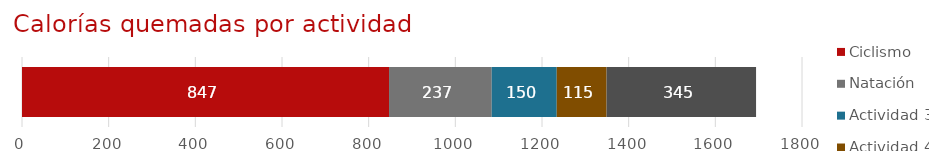
| Category | Ciclismo | Natación | Actividad 3 | Actividad 4 | Actividad 5 |
|---|---|---|---|---|---|
| Seguimiento de actividad | 847 | 237 | 150 | 115 | 345 |